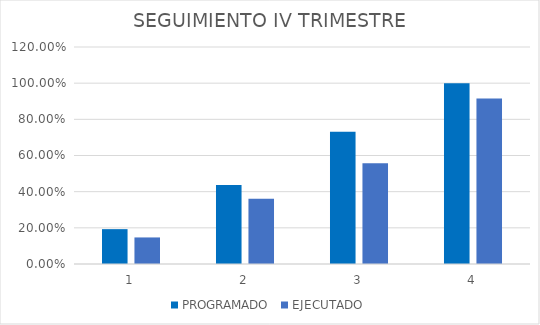
| Category | PROGRAMADO | EJECUTADO |
|---|---|---|
| 0 | 0.193 | 0.147 |
| 1 | 0.438 | 0.36 |
| 2 | 0.731 | 0.557 |
| 3 | 1 | 0.916 |